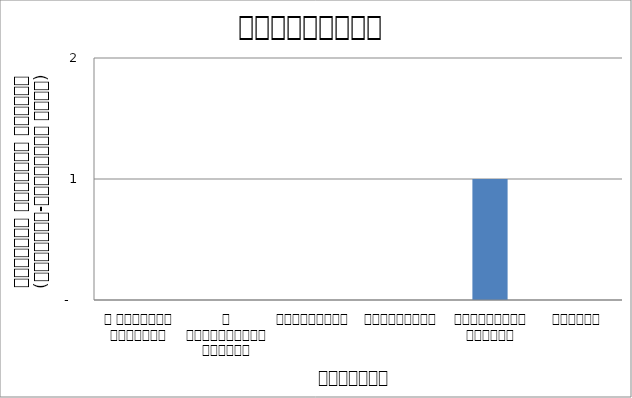
| Category | स्वास्थ्य  |
|---|---|
| द हिमालयन टाइम्स् | 0 |
| द काठमाण्डौं पोस्ट् | 0 |
| रिपब्लिका | 0 |
| कान्तिपुर | 0 |
| अन्नपूर्ण पोस्ट् | 1 |
| नागरिक | 0 |